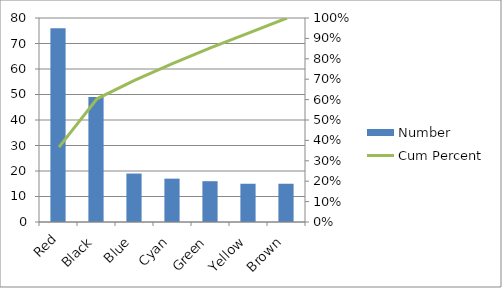
| Category | Number |
|---|---|
| Red | 76 |
| Black | 49 |
| Blue | 19 |
| Cyan | 17 |
| Green | 16 |
| Yellow | 15 |
| Brown | 15 |